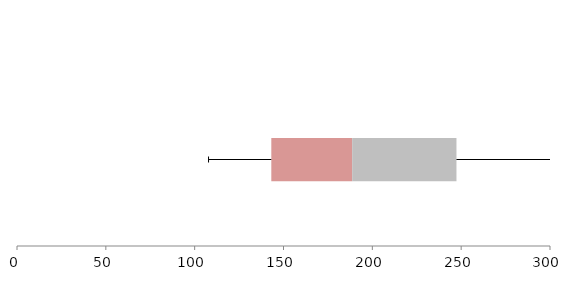
| Category | Series 1 | Series 2 | Series 3 |
|---|---|---|---|
| 0 | 143.139 | 45.525 | 58.69 |